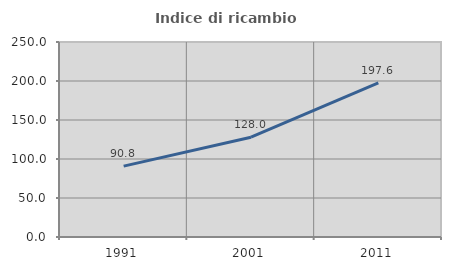
| Category | Indice di ricambio occupazionale  |
|---|---|
| 1991.0 | 90.841 |
| 2001.0 | 127.959 |
| 2011.0 | 197.645 |